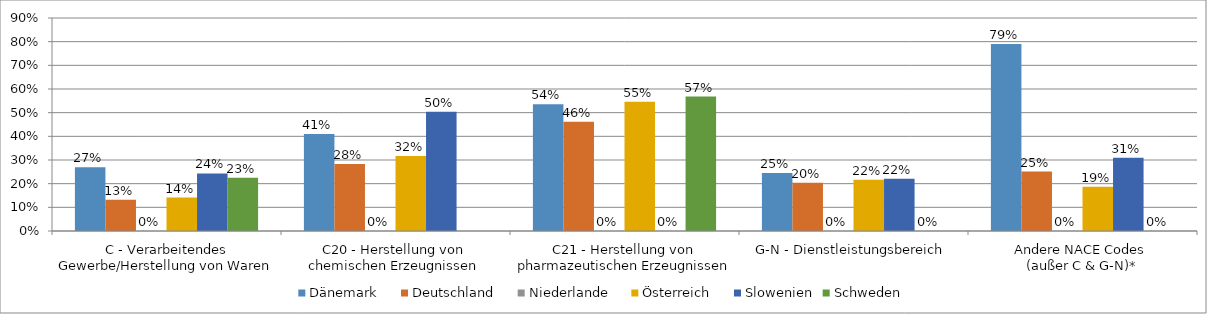
| Category | Dänemark | Deutschland | Niederlande | Österreich | Slowenien | Schweden |
|---|---|---|---|---|---|---|
| C - Verarbeitendes Gewerbe/Herstellung von Waren | 0.27 | 0.132 | 0 | 0.141 | 0.243 | 0.225 |
| C20 - Herstellung von chemischen Erzeugnissen | 0.41 | 0.283 | 0 | 0.317 | 0.504 | 0 |
| C21 - Herstellung von pharmazeutischen Erzeugnissen | 0.535 | 0.462 | 0 | 0.546 | 0 | 0.568 |
| G-N - Dienstleistungsbereich | 0.245 | 0.203 | 0 | 0.216 | 0.221 | 0 |
| Andere NACE Codes 
(außer C & G-N)* | 0.79 | 0.251 | 0 | 0.187 | 0.31 | 0 |